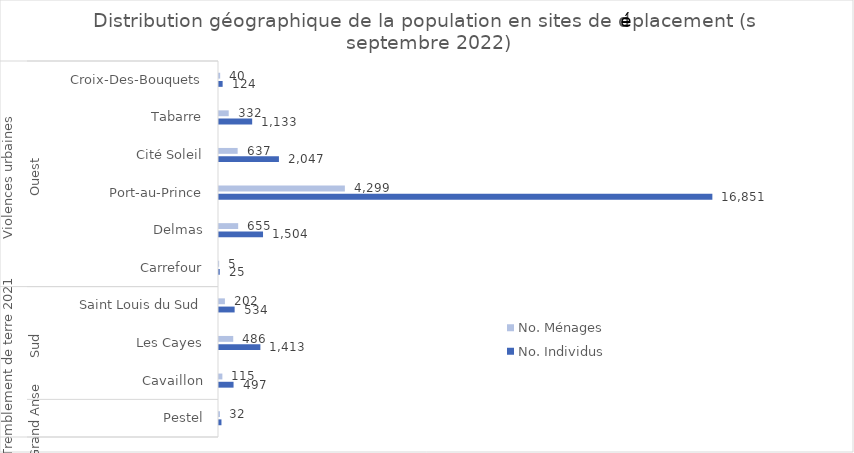
| Category | No. Individus | No. Ménages |
|---|---|---|
| 0 | 84 | 32 |
| 1 | 497 | 115 |
| 2 | 1413 | 486 |
| 3 | 534 | 202 |
| 4 | 25 | 5 |
| 5 | 1504 | 655 |
| 6 | 16851 | 4299 |
| 7 | 2047 | 637 |
| 8 | 1133 | 332 |
| 9 | 124 | 40 |